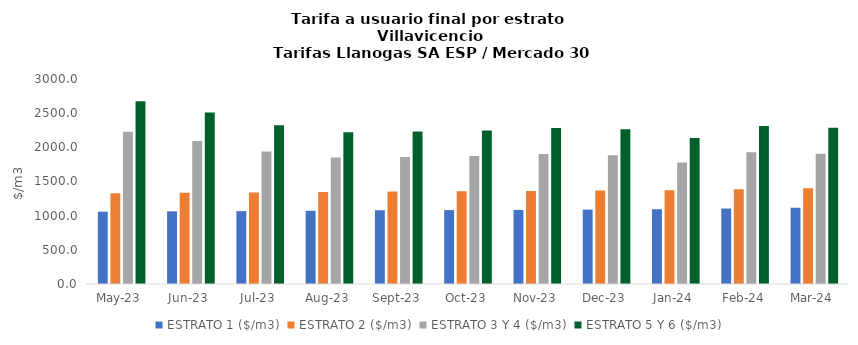
| Category | ESTRATO 1 ($/m3) | ESTRATO 2 ($/m3) | ESTRATO 3 Y 4 ($/m3) | ESTRATO 5 Y 6 ($/m3) |
|---|---|---|---|---|
| 2023-05-01 | 1058.67 | 1328.49 | 2227.49 | 2672.988 |
| 2023-06-01 | 1063.04 | 1333.97 | 2092.35 | 2510.82 |
| 2023-07-01 | 1066.3 | 1338.06 | 1937.39 | 2324.868 |
| 2023-08-01 | 1071.54 | 1344.64 | 1852.08 | 2222.496 |
| 2023-09-01 | 1079.09 | 1354.11 | 1858.9 | 2230.68 |
| 2023-10-01 | 1081.39 | 1357 | 1871.96 | 2246.352 |
| 2023-11-01 | 1084.09 | 1360.39 | 1903.33 | 2283.996 |
| 2023-12-01 | 1089.17 | 1366.77 | 1885.93 | 2263.116 |
| 2024-01-01 | 1094.18 | 1373.05 | 1779.87 | 2135.844 |
| 2024-02-01 | 1104.19 | 1385.61 | 1926.98 | 2312.376 |
| 2024-03-01 | 1116.19 | 1400.66 | 1905.63 | 2286.756 |